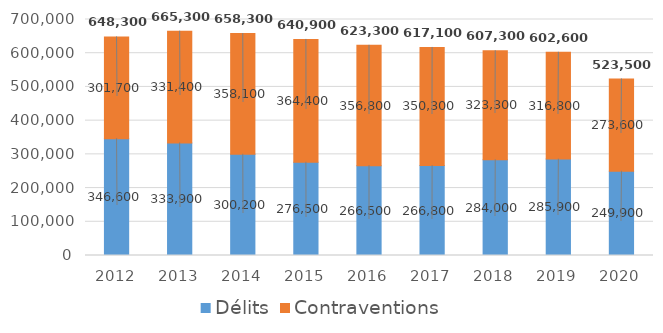
| Category | Délits | Contraventions |
|---|---|---|
| 2012.0 | 346600 | 301700 |
| 2013.0 | 333900 | 331400 |
| 2014.0 | 300200 | 358100 |
| 2015.0 | 276500 | 364400 |
| 2016.0 | 266500 | 356800 |
| 2017.0 | 266800 | 350300 |
| 2018.0 | 284000 | 323300 |
| 2019.0 | 285900 | 316800 |
| 2020.0 | 249900 | 273600 |